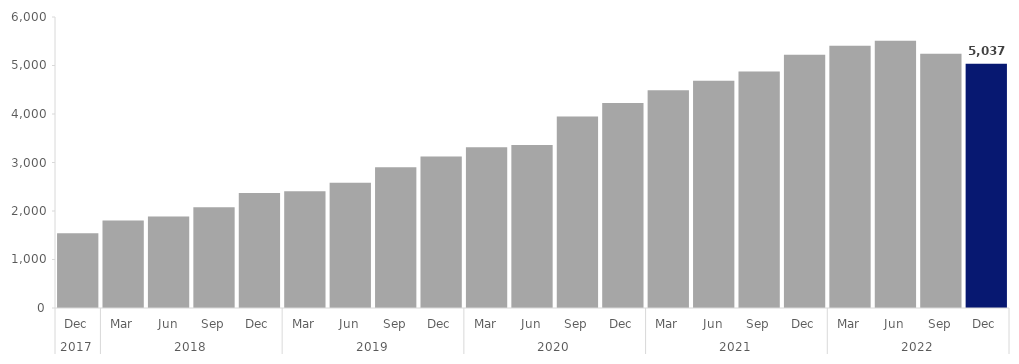
| Category | Series 0 |
|---|---|
| 0 | 1542 |
| 1 | 1806 |
| 2 | 1887 |
| 3 | 2076 |
| 4 | 2373 |
| 5 | 2406 |
| 6 | 2580 |
| 7 | 2901 |
| 8 | 3126 |
| 9 | 3312 |
| 10 | 3360 |
| 11 | 3948 |
| 12 | 4227 |
| 13 | 4488 |
| 14 | 4686 |
| 15 | 4875 |
| 16 | 5223 |
| 17 | 5409 |
| 18 | 5511 |
| 19 | 5241 |
| 20 | 5037 |